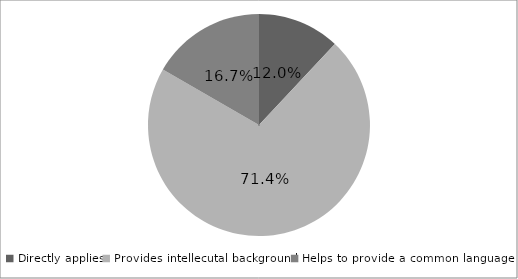
| Category | Series 0 |
|---|---|
| Directly applies | 0.12 |
| Provides intellecutal background | 0.714 |
| Helps to provide a common language | 0.167 |